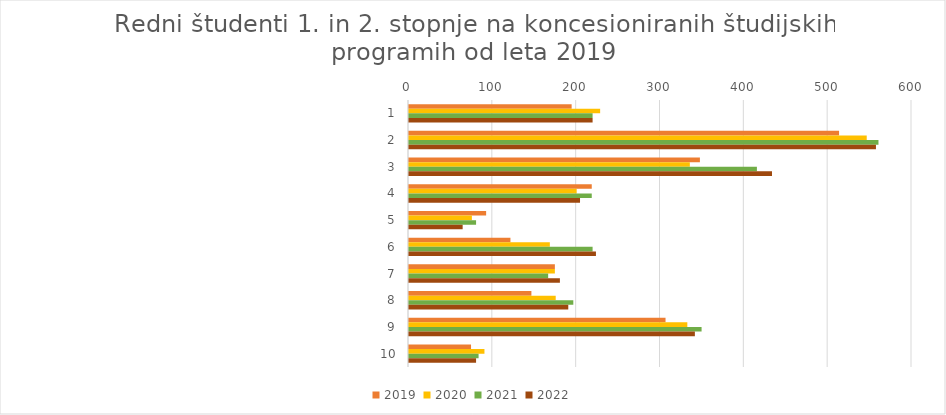
| Category | 2019 | 2020 | 2021 | 2022 |
|---|---|---|---|---|
| 0 | 194 | 228 | 219 | 219 |
| 1 | 513 | 546 | 560 | 557 |
| 2 | 347 | 335 | 415 | 433 |
| 3 | 218 | 200 | 218 | 204 |
| 4 | 92 | 75 | 80 | 64 |
| 5 | 121 | 168 | 219 | 223 |
| 6 | 174 | 174 | 166 | 180 |
| 7 | 146 | 175 | 196 | 190 |
| 8 | 306 | 332 | 349 | 341 |
| 9 | 74 | 90 | 83 | 80 |